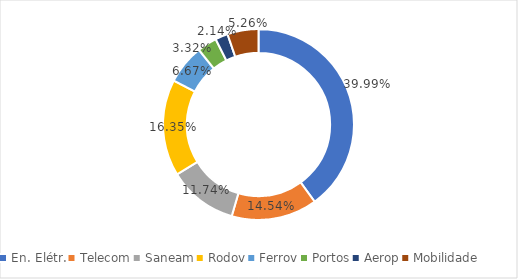
| Category | Series 0 |
|---|---|
| En. Elétr. | 0.4 |
| Telecom | 0.145 |
| Saneam | 0.117 |
| Rodov | 0.163 |
| Ferrov | 0.067 |
| Portos | 0.033 |
| Aerop | 0.021 |
| Mobilidade | 0.053 |